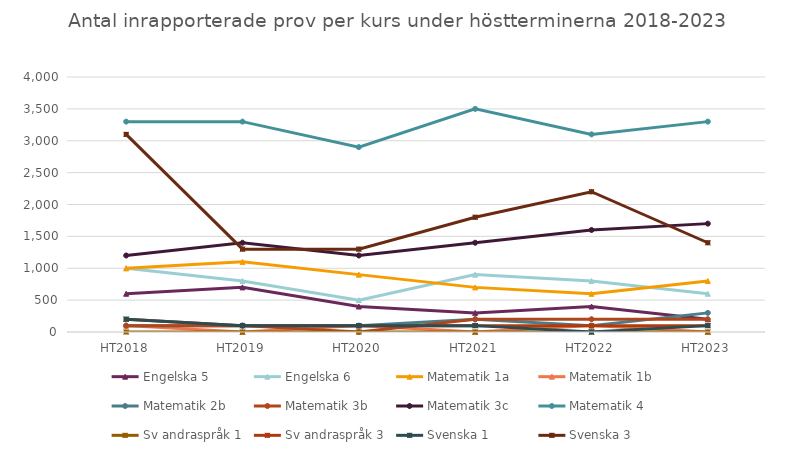
| Category | Engelska 5 | Engelska 6 | Matematik 1a | Matematik 1b | Matematik 2b | Matematik 3b | Matematik 3c | Matematik 4 | Sv andraspråk 1 | Sv andraspråk 3 | Svenska 1 | Svenska 3 |
|---|---|---|---|---|---|---|---|---|---|---|---|---|
| HT2018 | 600 | 1000 | 1000 | 100 | 100 | 100 | 1200 | 3300 | 0 | 200 | 200 | 3100 |
| HT2019 | 700 | 800 | 1100 | 0 | 100 | 100 | 1400 | 3300 | 0 | 100 | 100 | 1300 |
| HT2020 | 400 | 500 | 900 | 100 | 100 | 0 | 1200 | 2900 | 0 | 100 | 100 | 1300 |
| HT2021 | 300 | 900 | 700 | 0 | 200 | 200 | 1400 | 3500 | 0 | 100 | 100 | 1800 |
| HT2022 | 400 | 800 | 600 | 100 | 100 | 200 | 1600 | 3100 | 0 | 100 | 0 | 2200 |
| HT2023 | 200 | 600 | 800 | 0 | 300 | 200 | 1700 | 3300 | 0 | 100 | 100 | 1400 |